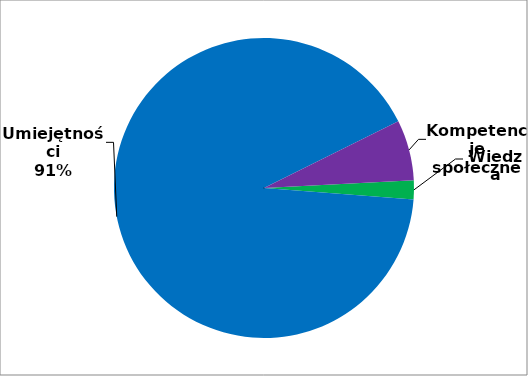
| Category | Series 0 |
|---|---|
| 0 | 12 |
| 1 | 534 |
| 2 | 38 |